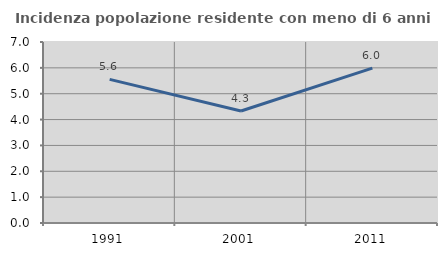
| Category | Incidenza popolazione residente con meno di 6 anni |
|---|---|
| 1991.0 | 5.556 |
| 2001.0 | 4.33 |
| 2011.0 | 5.992 |